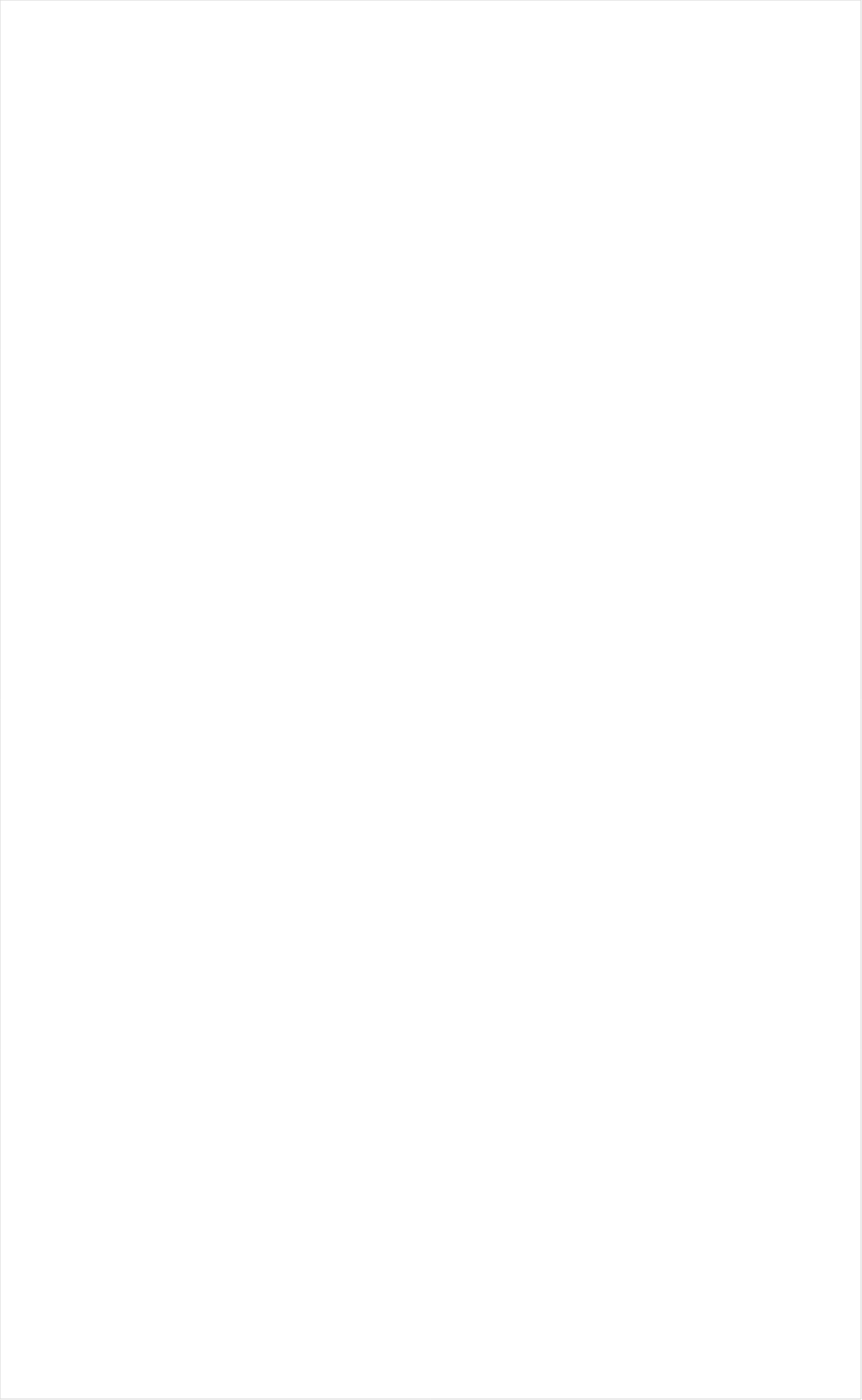
| Category | Total |
|---|---|
| RFD TV | -0.217 |
| MyNetworkTV | -0.189 |
| Hallmark Movies & Mysteries | -0.188 |
| Fox Business | -0.178 |
| PBS | -0.171 |
| MSNBC | -0.17 |
| Tennis Channel | -0.164 |
| NHL | -0.156 |
| SundanceTV | -0.147 |
| Fox News | -0.144 |
| INSP | -0.136 |
| Smithsonian | -0.126 |
| Science Channel | -0.126 |
| CBS | -0.122 |
| Outdoor Channel | -0.118 |
| Hallmark | -0.111 |
| National Geographic Wild | -0.11 |
| MLB Network | -0.106 |
| CBS Sports | -0.105 |
| CNN | -0.097 |
| NBC | -0.096 |
| Great American Country | -0.095 |
| NBC Sports | -0.094 |
| American Heroes Channel | -0.093 |
| DIY | -0.089 |
| Logo | -0.088 |
| Bloomberg HD | -0.088 |
| ESPNU | -0.088 |
| History Channel | -0.082 |
| HGTV | -0.08 |
| Reelz Channel | -0.075 |
| Fox Sports 1 | -0.074 |
| Investigation Discovery | -0.071 |
| National Geographic | -0.071 |
| FXDEP | -0.07 |
| Motor Trend Network | -0.07 |
| FYI | -0.069 |
| CW | -0.068 |
| Weather Channel | -0.066 |
| ABC | -0.066 |
| Game Show | -0.063 |
| Destination America | -0.057 |
| TV LAND | -0.051 |
| ION | -0.049 |
| UP TV | -0.048 |
| WGN America | -0.048 |
| AMC | -0.048 |
| Oprah Winfrey Network | -0.046 |
| Animal Planet | -0.045 |
| Cooking Channel | -0.041 |
| Travel | -0.037 |
| Discovery Channel | -0.034 |
| The Sportsman Channel | -0.032 |
| OXYGEN | -0.031 |
| Headline News | -0.031 |
| FOX | -0.027 |
| Golf | -0.027 |
| POP | -0.026 |
| BBC America | -0.022 |
| Discovery Family Channel | -0.021 |
| Food Network | -0.018 |
| Big Ten Network | -0.016 |
| WE TV | -0.015 |
| TNT | -0.013 |
| Independent Film (IFC) | -0.011 |
| Paramount Network | -0.009 |
| Ovation | -0.009 |
| CNBC | -0.003 |
| CMTV | -0.002 |
| BET Her | -0.001 |
| truTV | 0.003 |
| TLC | 0.009 |
| PAC-12 Network | 0.01 |
| TBS | 0.01 |
| E! | 0.011 |
| USA Network | 0.012 |
| Olympic Channel | 0.014 |
| A&E | 0.016 |
| Lifetime | 0.019 |
| NFL Network | 0.026 |
| Viceland | 0.027 |
| BRAVO | 0.027 |
| FOX Sports 2 | 0.027 |
| TV ONE | 0.035 |
| ESPNEWS | 0.037 |
| FX | 0.037 |
| Lifetime Movies | 0.044 |
| FX Movie Channel | 0.053 |
| SYFY | 0.054 |
| ESPN2 | 0.054 |
| ESPN | 0.065 |
| NBA TV | 0.075 |
| Disney XD | 0.078 |
| FXX | 0.094 |
| Comedy Central | 0.102 |
| Discovery Life Channel | 0.12 |
| Freeform | 0.121 |
| BET | 0.126 |
| Disney Channel | 0.126 |
| ESPN Deportes | 0.138 |
| Nick@Nite | 0.14 |
| Nick | 0.16 |
| VH1 | 0.182 |
| MTV | 0.182 |
| MTV2 | 0.189 |
| Adult Swim | 0.193 |
| Universal Kids | 0.194 |
| Cartoon Network | 0.198 |
| Teen Nick | 0.206 |
| NBC Universo | 0.208 |
| Nick Toons | 0.208 |
| UniMas | 0.218 |
| Univision | 0.237 |
| Telemundo | 0.25 |
| Galavision | 0.255 |
| Disney Junior US | 0.306 |
| TUDN | 0.311 |
| Nick Jr. | 0.333 |